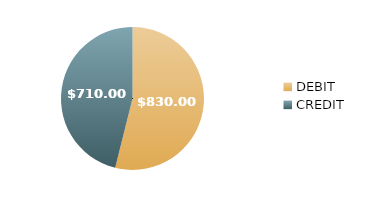
| Category | $830.00 $710.00 |
|---|---|
| DEBIT | 830 |
| CREDIT | 710 |